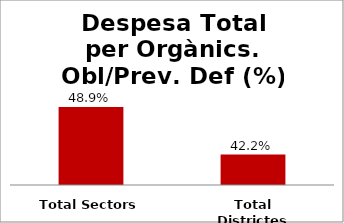
| Category | Series 0 |
|---|---|
| Total Sectors | 0.489 |
| Total Districtes | 0.422 |